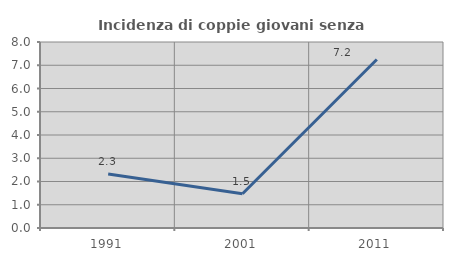
| Category | Incidenza di coppie giovani senza figli |
|---|---|
| 1991.0 | 2.326 |
| 2001.0 | 1.471 |
| 2011.0 | 7.246 |